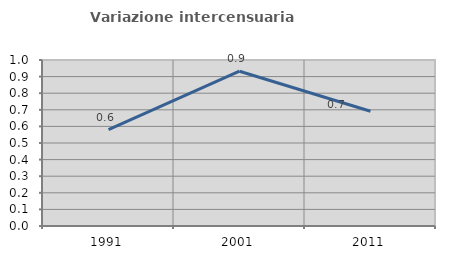
| Category | Variazione intercensuaria annua |
|---|---|
| 1991.0 | 0.581 |
| 2001.0 | 0.932 |
| 2011.0 | 0.691 |